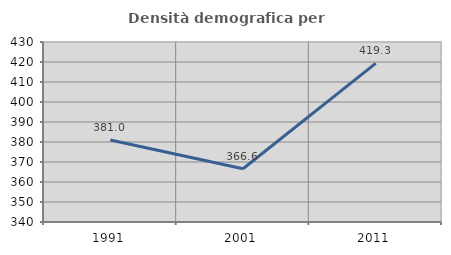
| Category | Densità demografica |
|---|---|
| 1991.0 | 380.979 |
| 2001.0 | 366.618 |
| 2011.0 | 419.315 |